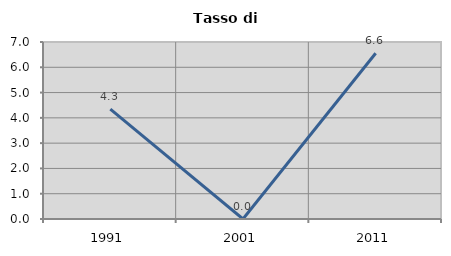
| Category | Tasso di disoccupazione   |
|---|---|
| 1991.0 | 4.348 |
| 2001.0 | 0 |
| 2011.0 | 6.557 |